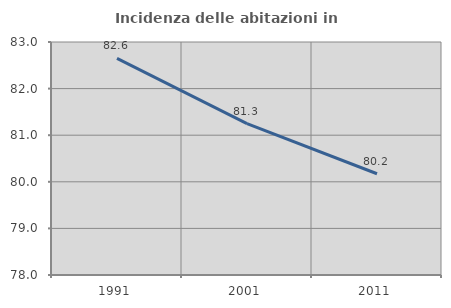
| Category | Incidenza delle abitazioni in proprietà  |
|---|---|
| 1991.0 | 82.648 |
| 2001.0 | 81.25 |
| 2011.0 | 80.172 |